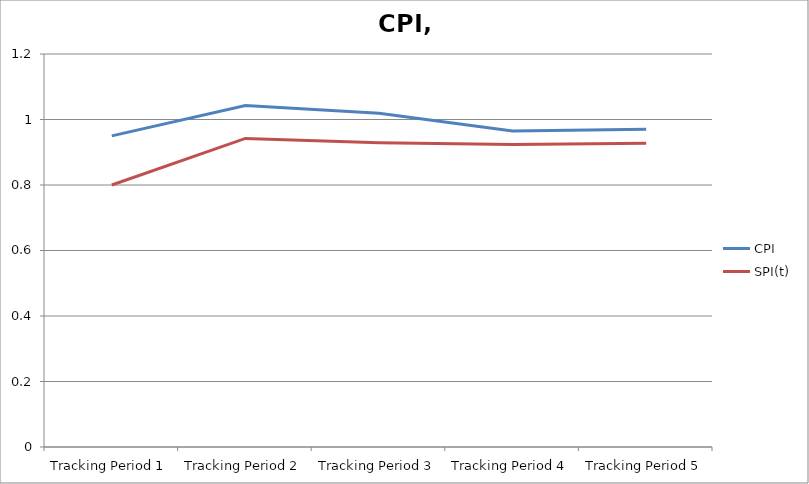
| Category | CPI | SPI(t) |
|---|---|---|
| Tracking Period 1 | 0.95 | 0.8 |
| Tracking Period 2 | 1.043 | 0.942 |
| Tracking Period 3 | 1.019 | 0.929 |
| Tracking Period 4 | 0.965 | 0.924 |
| Tracking Period 5 | 0.97 | 0.927 |